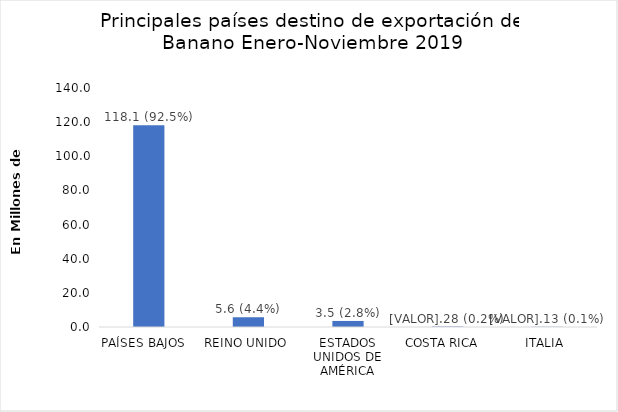
| Category | Series 0 |
|---|---|
| PAÍSES BAJOS   | 118121908 |
| REINO UNIDO  | 5650892 |
| ESTADOS UNIDOS DE AMÉRICA | 3548810 |
| COSTA RICA   | 286767 |
| ITALIA  | 138942 |